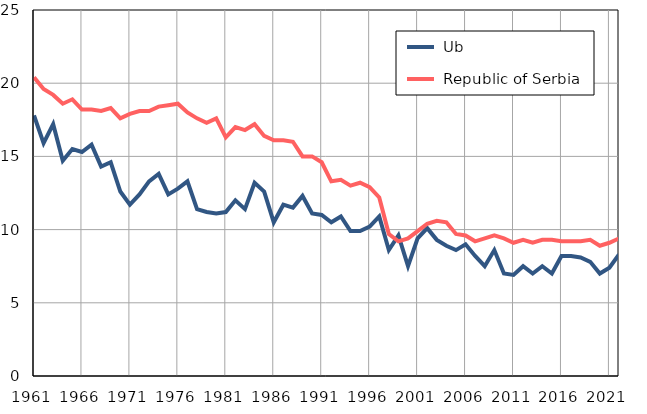
| Category |  Ub |  Republic of Serbia |
|---|---|---|
| 1961.0 | 17.8 | 20.4 |
| 1962.0 | 15.9 | 19.6 |
| 1963.0 | 17.2 | 19.2 |
| 1964.0 | 14.7 | 18.6 |
| 1965.0 | 15.5 | 18.9 |
| 1966.0 | 15.3 | 18.2 |
| 1967.0 | 15.8 | 18.2 |
| 1968.0 | 14.3 | 18.1 |
| 1969.0 | 14.6 | 18.3 |
| 1970.0 | 12.6 | 17.6 |
| 1971.0 | 11.7 | 17.9 |
| 1972.0 | 12.4 | 18.1 |
| 1973.0 | 13.3 | 18.1 |
| 1974.0 | 13.8 | 18.4 |
| 1975.0 | 12.4 | 18.5 |
| 1976.0 | 12.8 | 18.6 |
| 1977.0 | 13.3 | 18 |
| 1978.0 | 11.4 | 17.6 |
| 1979.0 | 11.2 | 17.3 |
| 1980.0 | 11.1 | 17.6 |
| 1981.0 | 11.2 | 16.3 |
| 1982.0 | 12 | 17 |
| 1983.0 | 11.4 | 16.8 |
| 1984.0 | 13.2 | 17.2 |
| 1985.0 | 12.6 | 16.4 |
| 1986.0 | 10.5 | 16.1 |
| 1987.0 | 11.7 | 16.1 |
| 1988.0 | 11.5 | 16 |
| 1989.0 | 12.3 | 15 |
| 1990.0 | 11.1 | 15 |
| 1991.0 | 11 | 14.6 |
| 1992.0 | 10.5 | 13.3 |
| 1993.0 | 10.9 | 13.4 |
| 1994.0 | 9.9 | 13 |
| 1995.0 | 9.9 | 13.2 |
| 1996.0 | 10.2 | 12.9 |
| 1997.0 | 10.9 | 12.2 |
| 1998.0 | 8.6 | 9.7 |
| 1999.0 | 9.6 | 9.2 |
| 2000.0 | 7.5 | 9.4 |
| 2001.0 | 9.4 | 9.9 |
| 2002.0 | 10.1 | 10.4 |
| 2003.0 | 9.3 | 10.6 |
| 2004.0 | 8.9 | 10.5 |
| 2005.0 | 8.6 | 9.7 |
| 2006.0 | 9 | 9.6 |
| 2007.0 | 8.2 | 9.2 |
| 2008.0 | 7.5 | 9.4 |
| 2009.0 | 8.6 | 9.6 |
| 2010.0 | 7 | 9.4 |
| 2011.0 | 6.9 | 9.1 |
| 2012.0 | 7.5 | 9.3 |
| 2013.0 | 7 | 9.1 |
| 2014.0 | 7.5 | 9.3 |
| 2015.0 | 7 | 9.3 |
| 2016.0 | 8.2 | 9.2 |
| 2017.0 | 8.2 | 9.2 |
| 2018.0 | 8.1 | 9.2 |
| 2019.0 | 7.8 | 9.3 |
| 2020.0 | 7 | 8.9 |
| 2021.0 | 7.4 | 9.1 |
| 2022.0 | 8.3 | 9.4 |